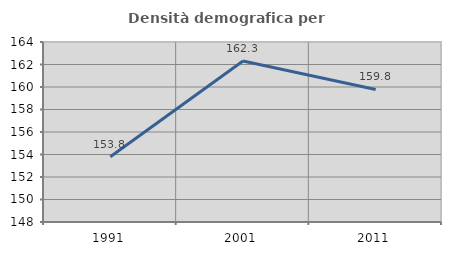
| Category | Densità demografica |
|---|---|
| 1991.0 | 153.807 |
| 2001.0 | 162.308 |
| 2011.0 | 159.784 |